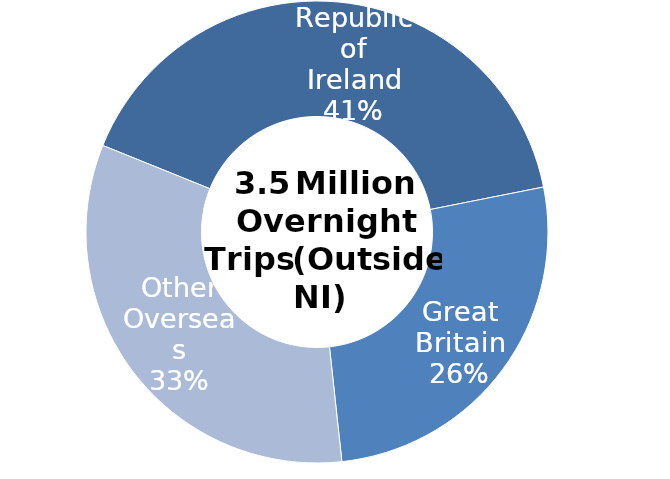
| Category | Series 0 |
|---|---|
| Republic of Ireland | 1411353 |
| Great Britain | 913954 |
| Other Overseas | 1136480 |